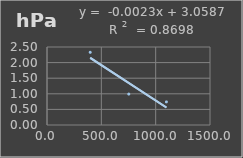
| Category | Presión Atmosférica |
|---|---|
| 397.746 | 2.33 |
| 752.619 | 0.991 |
| 1098.834 | 0.74 |